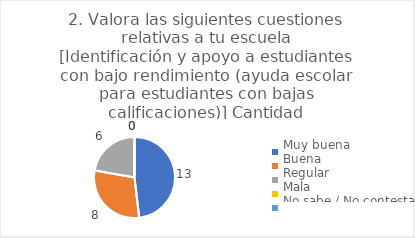
| Category | 2. Valora las siguientes cuestiones relativas a tu escuela
[Identificación y apoyo a estudiantes con bajo rendimiento (ayuda escolar para estudiantes con bajas calificaciones)] |
|---|---|
| Muy buena  | 0.481 |
| Buena  | 0.296 |
| Regular  | 0.222 |
| Mala  | 0 |
| No sabe / No contesta | 0 |